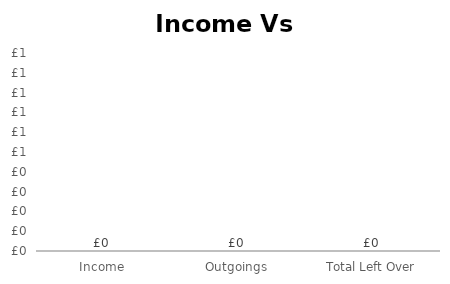
| Category | Series 0 |
|---|---|
| Income | 0 |
| Outgoings | 0 |
| Total Left Over | 0 |